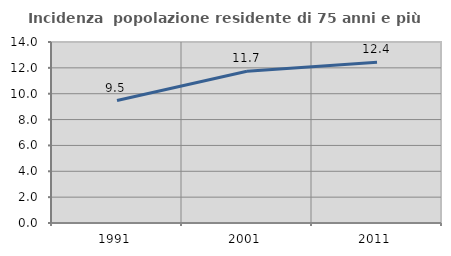
| Category | Incidenza  popolazione residente di 75 anni e più |
|---|---|
| 1991.0 | 9.472 |
| 2001.0 | 11.741 |
| 2011.0 | 12.443 |